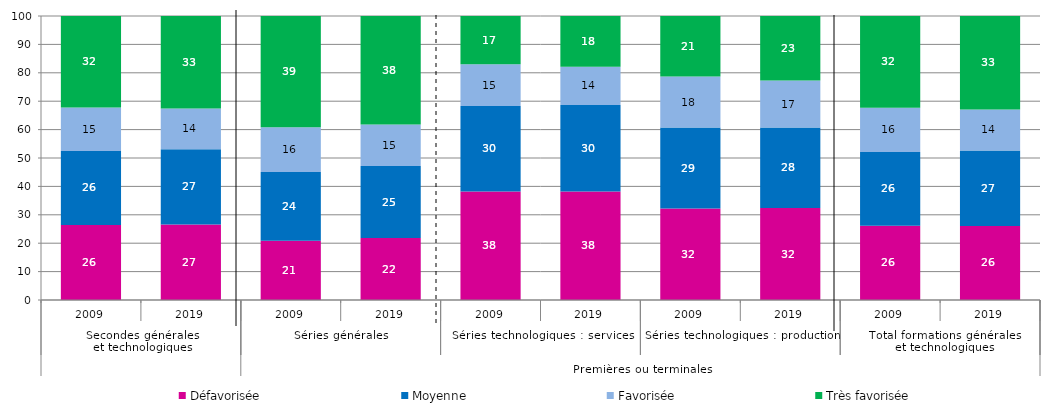
| Category | Défavorisée | Moyenne | Favorisée | Très favorisée |
|---|---|---|---|---|
| 0 | 26.45 | 26.04 | 15.27 | 32.24 |
| 1 | 26.579 | 26.516 | 14.332 | 32.573 |
| 2 | 20.89 | 24.21 | 15.72 | 39.18 |
| 3 | 21.797 | 25.368 | 14.633 | 38.202 |
| 4 | 38.17 | 30.16 | 14.68 | 16.99 |
| 5 | 38.206 | 30.424 | 13.526 | 17.844 |
| 6 | 32.21 | 28.5 | 17.98 | 21.31 |
| 7 | 32.36 | 28.347 | 16.556 | 22.736 |
| 8 | 26.11 | 26 | 15.55 | 32.35 |
| 9 | 26.07 | 26.559 | 14.485 | 32.887 |